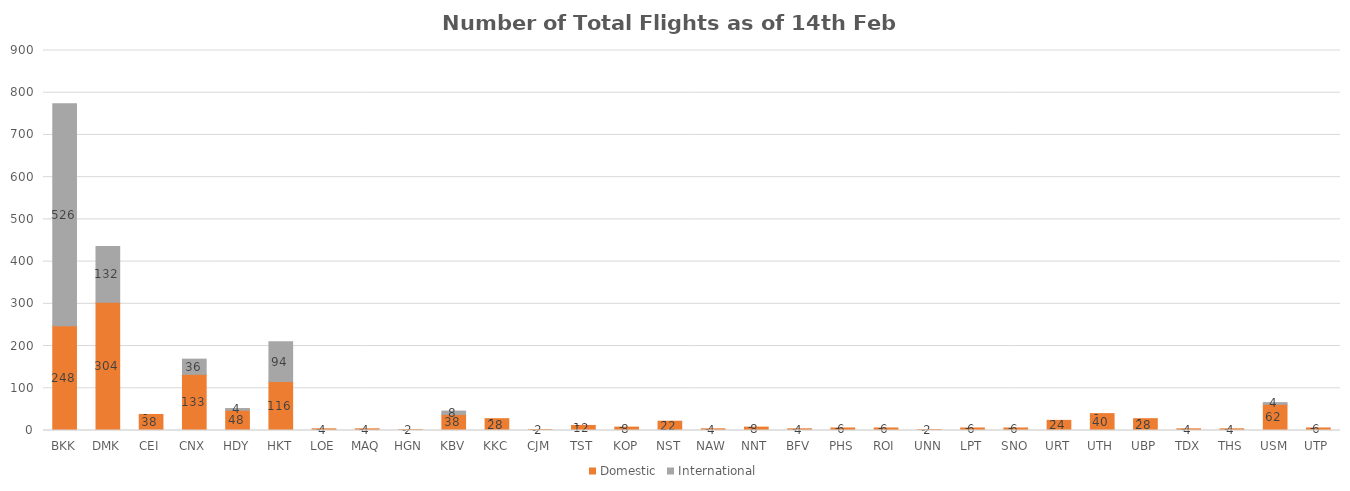
| Category | Domestic | International |
|---|---|---|
| BKK | 248 | 526 |
| DMK | 304 | 132 |
| CEI | 38 | 0 |
| CNX | 133 | 36 |
| HDY | 48 | 4 |
| HKT | 116 | 94 |
| LOE | 4 | 0 |
| MAQ | 4 | 0 |
| HGN | 2 | 0 |
| KBV | 38 | 8 |
| KKC | 28 | 0 |
| CJM | 2 | 0 |
| TST | 12 | 0 |
| KOP | 8 | 0 |
| NST | 22 | 0 |
| NAW | 4 | 0 |
| NNT | 8 | 0 |
| BFV | 4 | 0 |
| PHS | 6 | 0 |
| ROI | 6 | 0 |
| UNN | 2 | 0 |
| LPT | 6 | 0 |
| SNO | 6 | 0 |
| URT | 24 | 0 |
| UTH | 40 | 0 |
| UBP | 28 | 0 |
| TDX | 4 | 0 |
| THS | 4 | 0 |
| USM | 62 | 4 |
| UTP | 6 | 0 |